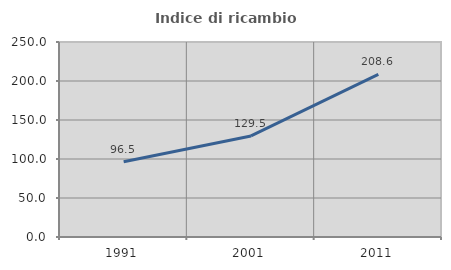
| Category | Indice di ricambio occupazionale  |
|---|---|
| 1991.0 | 96.477 |
| 2001.0 | 129.537 |
| 2011.0 | 208.56 |